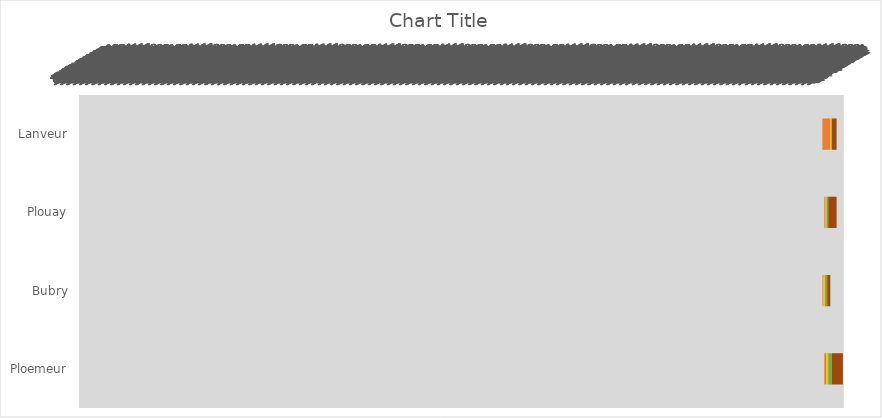
| Category | DSP | Intervalle |
|---|---|---|
| Lanveur | 2019-06-27 | 273 |
| Plouay | 2019-10-15 | 487 |
| Bubry | 2019-07-01 | 183 |
| Ploemeur | 2019-10-15 | 638 |